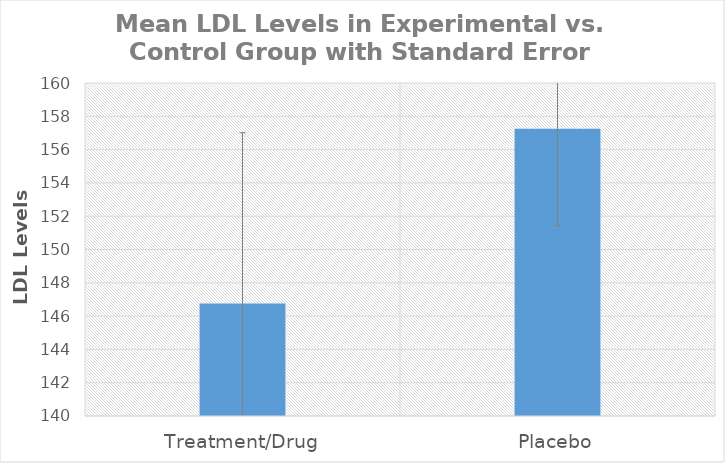
| Category | Series 0 |
|---|---|
| Treatment/Drug | 146.75 |
| Placebo | 157.25 |